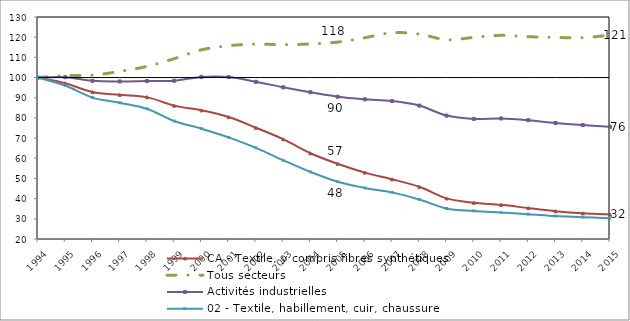
| Category | CA - Textile, y compris fibres synthétiques | Tous secteurs | Activités industrielles | 02 - Textile, habillement, cuir, chaussure | ligne 100 |
|---|---|---|---|---|---|
| 1994.0 | 100 | 100 | 100 | 100 | 100 |
| 1995.0 | 97.182 | 100.976 | 100.177 | 96.035 | 100 |
| 1996.0 | 92.803 | 101.173 | 98.38 | 90.058 | 100 |
| 1997.0 | 91.444 | 103.051 | 98.07 | 87.492 | 100 |
| 1998.0 | 90.301 | 105.521 | 98.25 | 84.517 | 100 |
| 1999.0 | 86.083 | 109.358 | 98.431 | 78.46 | 100 |
| 2000.0 | 83.746 | 113.726 | 100.323 | 74.667 | 100 |
| 2001.0 | 80.413 | 115.771 | 100.271 | 70.351 | 100 |
| 2002.0 | 75.123 | 116.569 | 97.885 | 65.182 | 100 |
| 2003.0 | 69.443 | 116.267 | 95.164 | 59.024 | 100 |
| 2004.0 | 62.492 | 116.656 | 92.721 | 53.253 | 100 |
| 2005.0 | 57.27 | 117.561 | 90.499 | 48.377 | 100 |
| 2006.0 | 52.901 | 119.737 | 89.204 | 45.322 | 100 |
| 2007.0 | 49.605 | 122.208 | 88.346 | 43.101 | 100 |
| 2008.0 | 45.858 | 121.534 | 86.116 | 39.605 | 100 |
| 2009.0 | 40.114 | 118.728 | 81.147 | 35.128 | 100 |
| 2010.0 | 37.977 | 119.898 | 79.514 | 33.904 | 100 |
| 2011.0 | 36.912 | 120.906 | 79.731 | 33.105 | 100 |
| 2012.0 | 35.332 | 120.241 | 78.879 | 32.315 | 100 |
| 2013.0 | 33.796 | 119.868 | 77.479 | 31.339 | 100 |
| 2014.0 | 32.736 | 119.744 | 76.439 | 30.809 | 100 |
| 2015.0 | 32.193 | 121.011 | 75.604 | 30.222 | 100 |